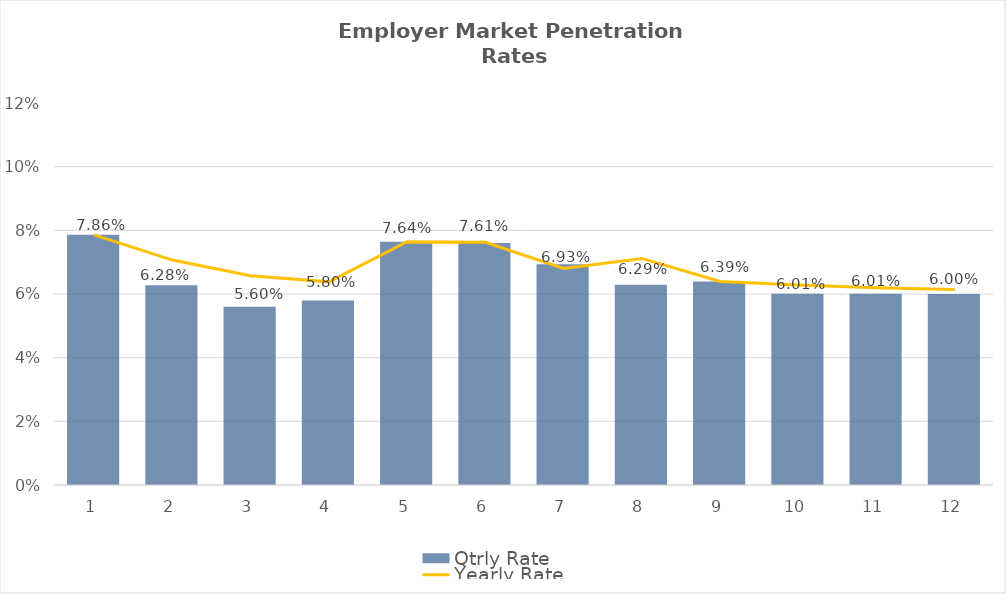
| Category | Qtrly Rate |
|---|---|
| 0 | 0.079 |
| 1 | 0.063 |
| 2 | 0.056 |
| 3 | 0.058 |
| 4 | 0.076 |
| 5 | 0.076 |
| 6 | 0.069 |
| 7 | 0.063 |
| 8 | 0.064 |
| 9 | 0.06 |
| 10 | 0.06 |
| 11 | 0.06 |